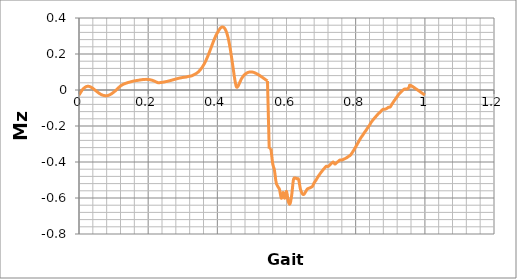
| Category | Series 0 |
|---|---|
| 0.0 | -0.028 |
| 0.005 | -0.013 |
| 0.01 | 0.002 |
| 0.015 | 0.011 |
| 0.02 | 0.018 |
| 0.025 | 0.021 |
| 0.03 | 0.02 |
| 0.035 | 0.015 |
| 0.04 | 0.009 |
| 0.045 | 0.002 |
| 0.05 | -0.006 |
| 0.055 | -0.014 |
| 0.06 | -0.021 |
| 0.065 | -0.026 |
| 0.07 | -0.03 |
| 0.075 | -0.031 |
| 0.08 | -0.032 |
| 0.085 | -0.03 |
| 0.09 | -0.025 |
| 0.095 | -0.02 |
| 0.1 | -0.013 |
| 0.105 | -0.005 |
| 0.11 | 0.004 |
| 0.115 | 0.013 |
| 0.12 | 0.023 |
| 0.125 | 0.028 |
| 0.13 | 0.033 |
| 0.135 | 0.037 |
| 0.14 | 0.04 |
| 0.145 | 0.043 |
| 0.15 | 0.046 |
| 0.155 | 0.048 |
| 0.16 | 0.051 |
| 0.165 | 0.052 |
| 0.17 | 0.054 |
| 0.175 | 0.055 |
| 0.18 | 0.057 |
| 0.185 | 0.058 |
| 0.19 | 0.059 |
| 0.195 | 0.059 |
| 0.2 | 0.059 |
| 0.205 | 0.057 |
| 0.21 | 0.055 |
| 0.215 | 0.052 |
| 0.22 | 0.048 |
| 0.225 | 0.043 |
| 0.23 | 0.04 |
| 0.235 | 0.041 |
| 0.24 | 0.043 |
| 0.245 | 0.044 |
| 0.25 | 0.046 |
| 0.255 | 0.048 |
| 0.26 | 0.05 |
| 0.265 | 0.053 |
| 0.27 | 0.056 |
| 0.275 | 0.058 |
| 0.28 | 0.061 |
| 0.285 | 0.063 |
| 0.29 | 0.066 |
| 0.295 | 0.068 |
| 0.3 | 0.07 |
| 0.305 | 0.071 |
| 0.31 | 0.072 |
| 0.315 | 0.075 |
| 0.32 | 0.077 |
| 0.325 | 0.078 |
| 0.33 | 0.083 |
| 0.335 | 0.088 |
| 0.34 | 0.093 |
| 0.345 | 0.101 |
| 0.35 | 0.111 |
| 0.355 | 0.123 |
| 0.36 | 0.138 |
| 0.365 | 0.156 |
| 0.37 | 0.177 |
| 0.375 | 0.2 |
| 0.38 | 0.225 |
| 0.385 | 0.251 |
| 0.39 | 0.276 |
| 0.395 | 0.299 |
| 0.4 | 0.317 |
| 0.405 | 0.334 |
| 0.41 | 0.346 |
| 0.415 | 0.35 |
| 0.42 | 0.345 |
| 0.425 | 0.329 |
| 0.43 | 0.299 |
| 0.435 | 0.254 |
| 0.44 | 0.197 |
| 0.445 | 0.131 |
| 0.45 | 0.065 |
| 0.455 | 0.018 |
| 0.46 | 0.022 |
| 0.465 | 0.043 |
| 0.47 | 0.063 |
| 0.475 | 0.077 |
| 0.48 | 0.087 |
| 0.485 | 0.094 |
| 0.49 | 0.098 |
| 0.495 | 0.1 |
| 0.5 | 0.1 |
| 0.505 | 0.098 |
| 0.51 | 0.094 |
| 0.515 | 0.089 |
| 0.52 | 0.083 |
| 0.525 | 0.077 |
| 0.53 | 0.07 |
| 0.535 | 0.064 |
| 0.54 | 0.057 |
| 0.545 | 0.05 |
| 0.55 | -0.327 |
| 0.555 | -0.325 |
| 0.56 | -0.408 |
| 0.565 | -0.444 |
| 0.57 | -0.514 |
| 0.575 | -0.536 |
| 0.58 | -0.554 |
| 0.585 | -0.602 |
| 0.59 | -0.569 |
| 0.595 | -0.601 |
| 0.6 | -0.563 |
| 0.605 | -0.618 |
| 0.61 | -0.633 |
| 0.615 | -0.585 |
| 0.62 | -0.499 |
| 0.625 | -0.489 |
| 0.63 | -0.493 |
| 0.635 | -0.497 |
| 0.64 | -0.548 |
| 0.645 | -0.574 |
| 0.65 | -0.58 |
| 0.655 | -0.566 |
| 0.66 | -0.55 |
| 0.665 | -0.546 |
| 0.67 | -0.542 |
| 0.675 | -0.535 |
| 0.68 | -0.516 |
| 0.685 | -0.501 |
| 0.69 | -0.485 |
| 0.695 | -0.471 |
| 0.7 | -0.457 |
| 0.705 | -0.445 |
| 0.71 | -0.434 |
| 0.715 | -0.424 |
| 0.72 | -0.425 |
| 0.725 | -0.416 |
| 0.73 | -0.408 |
| 0.735 | -0.4 |
| 0.74 | -0.412 |
| 0.745 | -0.404 |
| 0.75 | -0.396 |
| 0.755 | -0.389 |
| 0.76 | -0.389 |
| 0.765 | -0.385 |
| 0.77 | -0.38 |
| 0.775 | -0.375 |
| 0.78 | -0.368 |
| 0.785 | -0.362 |
| 0.79 | -0.348 |
| 0.795 | -0.333 |
| 0.8 | -0.316 |
| 0.805 | -0.299 |
| 0.81 | -0.282 |
| 0.815 | -0.265 |
| 0.82 | -0.252 |
| 0.825 | -0.237 |
| 0.83 | -0.224 |
| 0.835 | -0.209 |
| 0.84 | -0.195 |
| 0.845 | -0.179 |
| 0.85 | -0.167 |
| 0.855 | -0.155 |
| 0.86 | -0.144 |
| 0.865 | -0.133 |
| 0.87 | -0.124 |
| 0.875 | -0.114 |
| 0.88 | -0.107 |
| 0.885 | -0.107 |
| 0.89 | -0.103 |
| 0.895 | -0.096 |
| 0.9 | -0.094 |
| 0.905 | -0.078 |
| 0.91 | -0.064 |
| 0.915 | -0.05 |
| 0.92 | -0.036 |
| 0.925 | -0.023 |
| 0.93 | -0.014 |
| 0.935 | -0.004 |
| 0.94 | 0.004 |
| 0.945 | 0.005 |
| 0.95 | 0.006 |
| 0.955 | 0.017 |
| 0.96 | 0.024 |
| 1.0 | -0.028 |